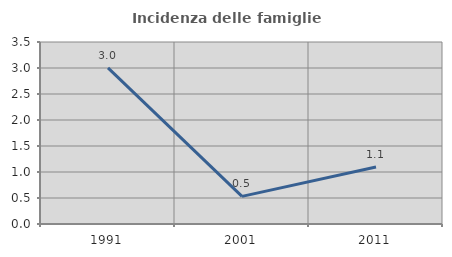
| Category | Incidenza delle famiglie numerose |
|---|---|
| 1991.0 | 3.003 |
| 2001.0 | 0.531 |
| 2011.0 | 1.097 |